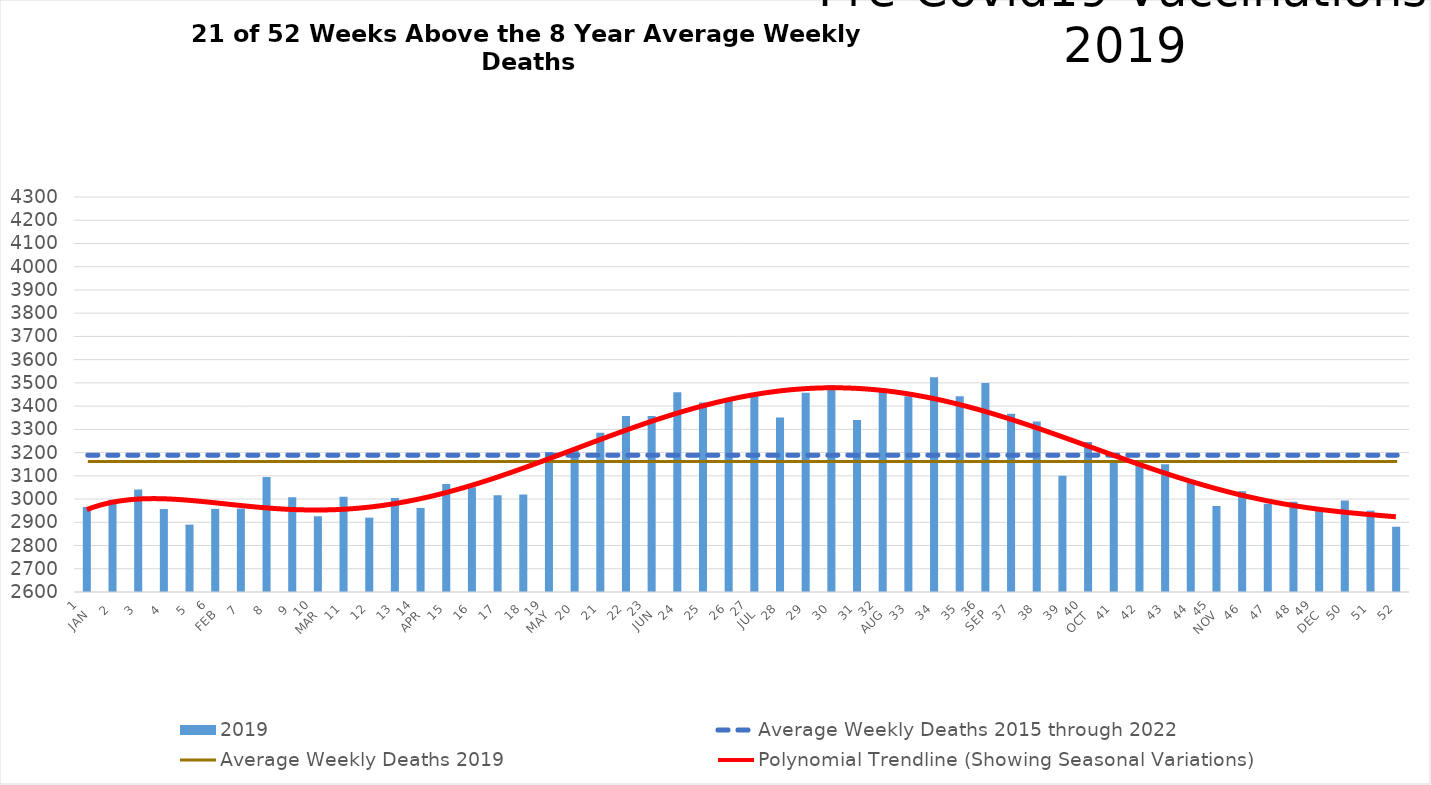
| Category | 2019 |
|---|---|
| 1
JAN | 2966 |
| 2 | 2997 |
| 3 | 3041 |
| 4 | 2957 |
| 5 | 2890 |
| 6
FEB | 2958 |
| 7 | 2959 |
| 8 | 3095 |
| 9 | 3008 |
| 10
MAR | 2926 |
| 11 | 3010 |
| 12 | 2920 |
| 13 | 3005 |
| 14
APR | 2962 |
| 15 | 3065 |
| 16 | 3051 |
| 17 | 3016 |
| 18 | 3020 |
| 19
MAY | 3202 |
| 20 | 3219 |
| 21 | 3285 |
| 22 | 3357 |
| 23
JUN | 3357 |
| 24 | 3460 |
| 25 | 3416 |
| 26 | 3427 |
| 27
JUL | 3451 |
| 28 | 3351 |
| 29 | 3457 |
| 30 | 3491 |
| 31 | 3340 |
| 32
AUG | 3476 |
| 33 | 3443 |
| 34 | 3524 |
| 35 | 3443 |
| 36
SEP | 3499 |
| 37 | 3367 |
| 38 | 3334 |
| 39 | 3100 |
| 40
OCT | 3246 |
| 41 | 3162 |
| 42 | 3148 |
| 43 | 3150 |
| 44 | 3082 |
| 45
NOV | 2970 |
| 46 | 3034 |
| 47 | 2980 |
| 48 | 2988 |
| 49
DEC | 2958 |
| 50 | 2994 |
| 51 | 2950 |
| 52 | 2881 |